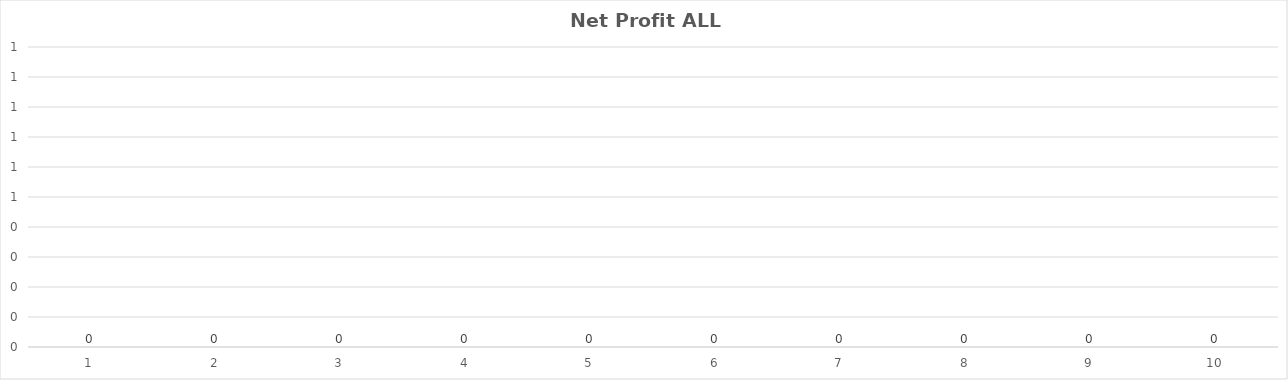
| Category | Profit Rank ALL Rounds |
|---|---|
| 0 | 0 |
| 1 | 0 |
| 2 | 0 |
| 3 | 0 |
| 4 | 0 |
| 5 | 0 |
| 6 | 0 |
| 7 | 0 |
| 8 | 0 |
| 9 | 0 |